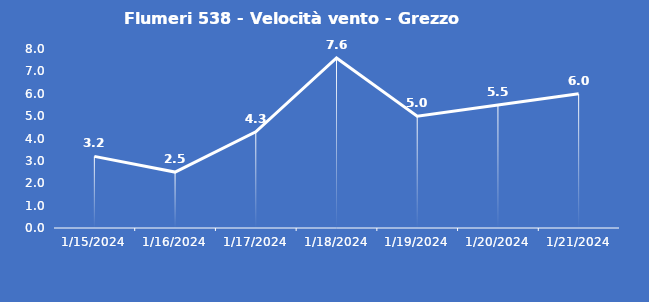
| Category | Flumeri 538 - Velocità vento - Grezzo (m/s) |
|---|---|
| 1/15/24 | 3.2 |
| 1/16/24 | 2.5 |
| 1/17/24 | 4.3 |
| 1/18/24 | 7.6 |
| 1/19/24 | 5 |
| 1/20/24 | 5.5 |
| 1/21/24 | 6 |